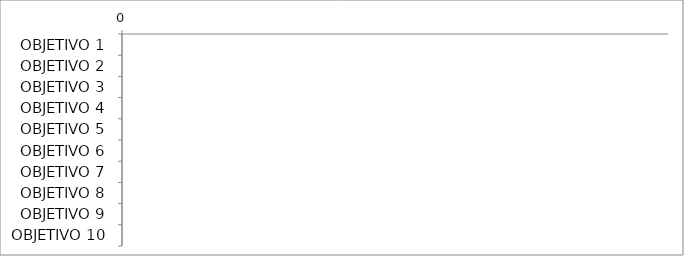
| Category | Series 0 | Series 1 | Series 2 | Series 3 | Series 4 | Series 5 |
|---|---|---|---|---|---|---|
| OBJETIVO 1 | 0 | 0 | 0 | 0 | 0 | 0 |
| OBJETIVO 2 | 0 | 0 | 0 | 0 | 0 | 0 |
| OBJETIVO 3 | 0 | 0 | 0 | 0 | 0 | 0 |
| OBJETIVO 4 | 0 | 0 | 0 | 0 | 0 | 0 |
| OBJETIVO 5 | 0 | 0 | 0 | 0 | 0 | 0 |
| OBJETIVO 6 | 0 | 0 | 0 | 0 | 0 | 0 |
| OBJETIVO 7 | 0 | 0 | 0 | 0 | 0 | 0 |
| OBJETIVO 8 | 0 | 0 | 0 | 0 | 0 | 0 |
| OBJETIVO 9 | 0 | 0 | 0 | 0 | 0 | 0 |
| OBJETIVO 10 | 0 | 0 | 0 | 0 | 0 | 0 |